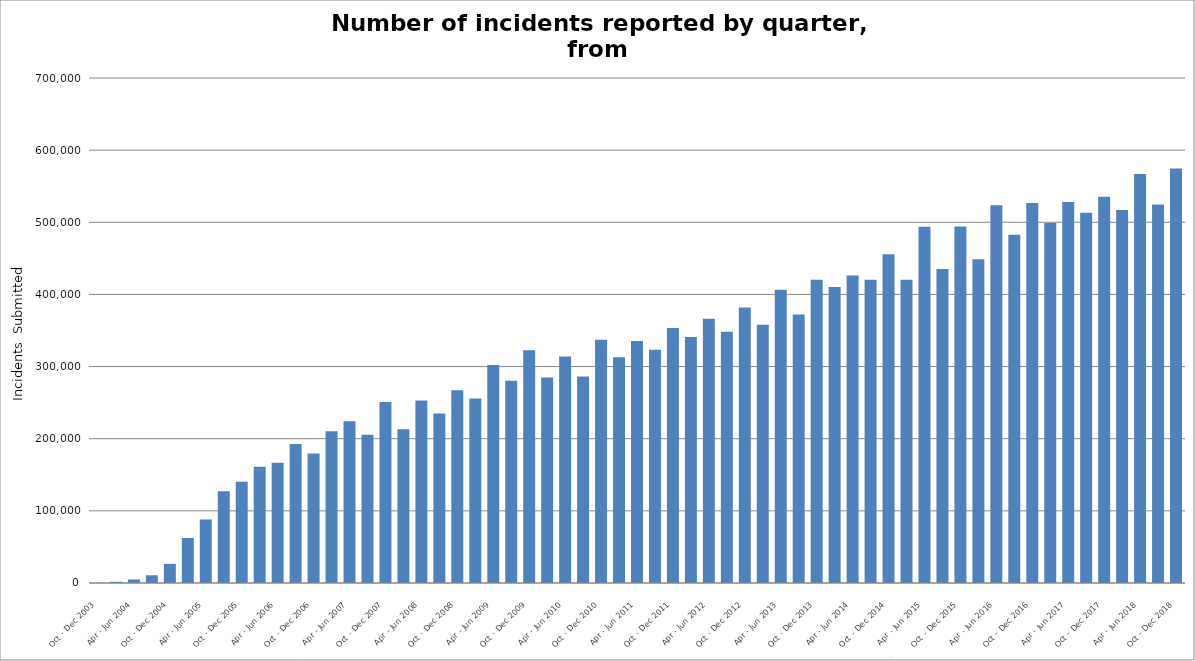
| Category | *All geographical locations |
|---|---|
| Oct - Dec 2003 | 158 |
| Jan - Mar 2004 | 1716 |
| Apr - Jun 2004 | 4823 |
| Jul - Sep 2004 | 10720 |
| Oct - Dec 2004 | 26508 |
| Jan - Mar 2005 | 62351 |
| Apr - Jun 2005 | 88042 |
| Jul - Sep 2005 | 127170 |
| Oct - Dec 2005 | 140394 |
| Jan - Mar 2006 | 161141 |
| Apr - Jun 2006 | 166539 |
| Jul - Sep 2006 | 192794 |
| Oct - Dec 2006 | 179538 |
| Jan - Mar 2007 | 210178 |
| Apr - Jun 2007 | 224047 |
| Jul - Sep 2007 | 205357 |
| Oct - Dec 2007 | 251010 |
| Jan - Mar 2008 | 213281 |
| Apr - Jun 2008 | 253006 |
| Jul - Sep 2008 | 234863 |
| Oct - Dec 2008 | 267135 |
| Jan - Mar 2009 | 255837 |
| Apr - Jun 2009 | 302198 |
| Jul - Sep 2009 | 280454 |
| Oct - Dec 2009 | 322757 |
| Jan - Mar 2010 | 284962 |
| Apr - Jun 2010 | 313827 |
| Jul - Sep 2010 | 286096 |
| Oct - Dec 2010 | 337149 |
| Jan - Mar 2011 | 312982 |
| Apr - Jun 2011 | 335327 |
| Jul - Sep 2011 | 323427 |
| Oct - Dec 2011 | 353578 |
| Jan - Mar 2012 | 340826 |
| Apr - Jun 2012 | 366262 |
| Jul - Sep 2012 | 348341 |
| Oct - Dec 2012 | 381754 |
| Jan - Mar 2013 | 358099 |
| Apr - Jun 2013 | 406617 |
| Jul - Sep 2013 | 372099 |
| Oct - Dec 2013 | 420297 |
| Jan - Mar 2014 | 410408 |
| Apr - Jun 2014 | 426315 |
| Jul - Sep 2014 | 420333 |
| Oct - Dec 2014 | 455584 |
| Jan - Mar 2015 | 420510 |
| Apr - Jun 2015 | 493795 |
| Jul - Sep 2015 | 435245 |
| Oct - Dec 2015 | 494082 |
| Jan - Mar 2016 | 448659 |
| Apr - Jun 2016 | 523610 |
| Jul - Sep 2016 | 482727 |
| Oct - Dec 2016 | 526580 |
| Jan - Mar 2017 | 499023 |
| Apr - Jun 2017 | 528164 |
| Jul - Sep 2017 | 513153 |
| Oct - Dec 2017 | 535229 |
| Jan - Mar 2018 | 516918 |
| Apr - Jun 2018 | 566898 |
| Jul - Sep 2018 | 524805 |
| Oct - Dec 2018 | 574574 |